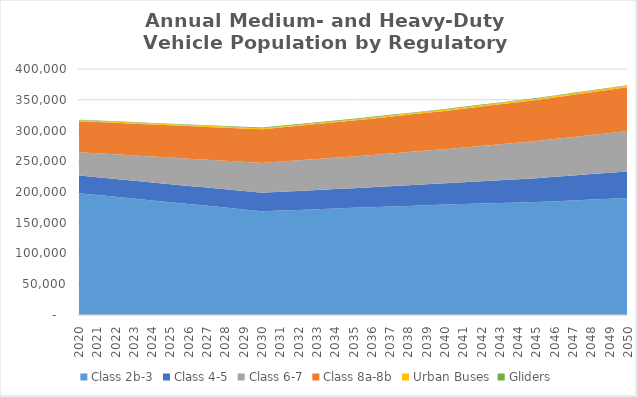
| Category | Class 2b-3 | Class 4-5 | Class 6-7 | Class 8a-8b | Urban Buses | Gliders |
|---|---|---|---|---|---|---|
| 2020.0 | 198100 | 28550 | 38000 | 50340 | 1710 | 740 |
| 2021.0 | 195160 | 28700 | 39050 | 50770 | 1710 | 770 |
| 2022.0 | 192230 | 28850 | 40110 | 51210 | 1720 | 790 |
| 2023.0 | 189290 | 29010 | 41160 | 51640 | 1720 | 820 |
| 2024.0 | 186360 | 29160 | 42220 | 52080 | 1730 | 840 |
| 2025.0 | 183420 | 29310 | 43270 | 52510 | 1730 | 870 |
| 2026.0 | 180480 | 29460 | 44320 | 52940 | 1730 | 900 |
| 2027.0 | 177540 | 29610 | 45370 | 53370 | 1740 | 920 |
| 2028.0 | 174610 | 29770 | 46430 | 53810 | 1740 | 950 |
| 2029.0 | 171670 | 29920 | 47480 | 54240 | 1750 | 970 |
| 2030.0 | 168730 | 30070 | 48530 | 54670 | 1750 | 1000 |
| 2031.0 | 169830 | 30440 | 49150 | 55390 | 1780 | 1010 |
| 2032.0 | 170930 | 30810 | 49780 | 56110 | 1810 | 1020 |
| 2033.0 | 172040 | 31170 | 50400 | 56840 | 1850 | 1020 |
| 2034.0 | 173140 | 31540 | 51030 | 57560 | 1880 | 1030 |
| 2035.0 | 174240 | 31910 | 51650 | 58280 | 1910 | 1040 |
| 2036.0 | 175300 | 32470 | 52410 | 59060 | 1950 | 1040 |
| 2037.0 | 176360 | 33030 | 53160 | 59850 | 1980 | 1040 |
| 2038.0 | 177410 | 33590 | 53920 | 60630 | 2020 | 1050 |
| 2039.0 | 178470 | 34150 | 54670 | 61420 | 2050 | 1050 |
| 2040.0 | 179530 | 34710 | 55430 | 62200 | 2090 | 1050 |
| 2041.0 | 180370 | 35500 | 56430 | 63110 | 2120 | 1040 |
| 2042.0 | 181210 | 36280 | 57430 | 64020 | 2150 | 1030 |
| 2043.0 | 182050 | 37070 | 58420 | 64940 | 2190 | 1030 |
| 2044.0 | 182890 | 37850 | 59420 | 65850 | 2220 | 1020 |
| 2045.0 | 183730 | 38640 | 60420 | 66760 | 2250 | 1010 |
| 2046.0 | 185020 | 39580 | 61480 | 67660 | 2280 | 1000 |
| 2047.0 | 186310 | 40520 | 62550 | 68560 | 2320 | 990 |
| 2048.0 | 187610 | 41470 | 63610 | 69460 | 2350 | 980 |
| 2049.0 | 188900 | 42410 | 64680 | 70360 | 2390 | 970 |
| 2050.0 | 190190 | 43350 | 65740 | 71260 | 2420 | 960 |